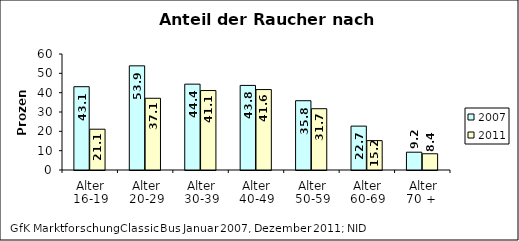
| Category | 2007 | 2011 |
|---|---|---|
| Alter
16-19 | 43.089 | 21.1 |
| Alter
20-29 | 53.878 | 37.1 |
| Alter
30-39 | 44.41 | 41.1 |
| Alter
40-49 | 43.75 | 41.6 |
| Alter
50-59 | 35.836 | 31.7 |
| Alter
60-69 | 22.699 | 15.2 |
| Alter
70 +  | 9.211 | 8.4 |